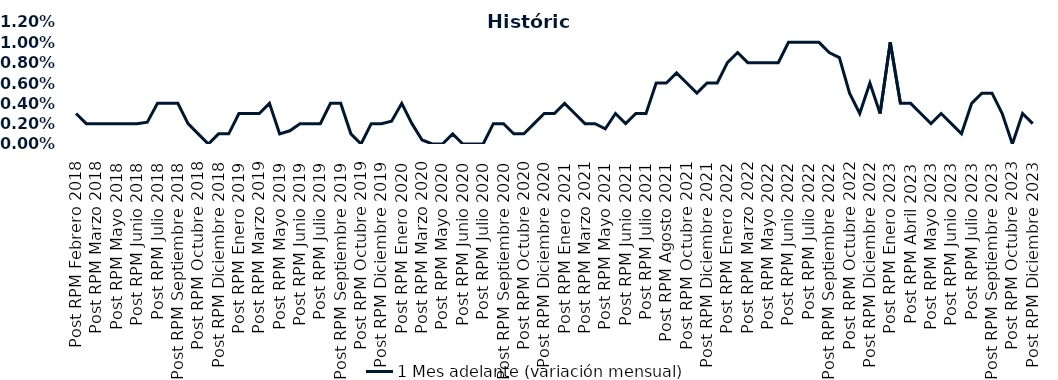
| Category | 1 Mes adelante (variación mensual) |
|---|---|
| Post RPM Febrero 2018 | 0.003 |
| Pre RPM Marzo 2018 | 0.002 |
| Post RPM Marzo 2018 | 0.002 |
| Pre RPM Mayo 2018 | 0.002 |
| Post RPM Mayo 2018 | 0.002 |
| Pre RPM Junio 2018 | 0.002 |
| Post RPM Junio 2018 | 0.002 |
| Pre RPM Julio 2018 | 0.002 |
| Post RPM Julio 2018 | 0.004 |
| Pre RPM Septiembre 2018 | 0.004 |
| Post RPM Septiembre 2018 | 0.004 |
| Pre RPM Octubre 2018 | 0.002 |
| Post RPM Octubre 2018 | 0.001 |
| Pre RPM Diciembre 2018 | 0 |
| Post RPM Diciembre 2018 | 0.001 |
| Pre RPM Enero 2019 | 0.001 |
| Post RPM Enero 2019 | 0.003 |
| Pre RPM Marzo 2019 | 0.003 |
| Post RPM Marzo 2019 | 0.003 |
| Pre RPM Mayo 2019 | 0.004 |
| Post RPM Mayo 2019 | 0.001 |
| Pre RPM Junio 2019 | 0.001 |
| Post RPM Junio 2019 | 0.002 |
| Pre RPM Julio 2019 | 0.002 |
| Post RPM Julio 2019 | 0.002 |
| Pre RPM Septiembre 2019 | 0.004 |
| Post RPM Septiembre 2019 | 0.004 |
| Pre RPM Octubre 2019 | 0.001 |
| Post RPM Octubre 2019 | 0 |
| Pre RPM Diciembre 2019 | 0.002 |
| Post RPM Diciembre 2019 | 0.002 |
| Pre RPM Enero 2020 | 0.002 |
| Post RPM Enero 2020 | 0.004 |
| Pre RPM Marzo 2020 | 0.002 |
| Post RPM Marzo 2020 | 0 |
| Pre RPM Mayo 2020 | 0 |
| Post RPM Mayo 2020 | 0 |
| Pre RPM Junio 2020 | 0.001 |
| Post RPM Junio 2020 | 0 |
| Pre RPM Julio 2020 | 0 |
| Post RPM Julio 2020 | 0 |
| Pre RPM Septiembre 2020 | 0.002 |
| Post RPM Septiembre 2020 | 0.002 |
| Pre RPM Octubre 2020 | 0.001 |
| Post RPM Octubre 2020 | 0.001 |
| Pre RPM Diciembre 2020 | 0.002 |
| Post RPM Diciembre 2020 | 0.003 |
| Pre RPM Enero 2021 | 0.003 |
| Post RPM Enero 2021 | 0.004 |
| Pre RPM Marzo 2021 | 0.003 |
| Post RPM Marzo 2021 | 0.002 |
| Pre RPM Mayo 2021 | 0.002 |
| Post RPM Mayo 2021 | 0.002 |
| Pre RPM Junio 2021 | 0.003 |
| Post RPM Junio 2021 | 0.002 |
| Pre RPM Julio 2021 | 0.003 |
| Post RPM Julio 2021 | 0.003 |
| Pre RPM Agosto 2021 | 0.006 |
| Post RPM Agosto 2021 | 0.006 |
| Pre RPM Octubre 2021 | 0.007 |
| Post RPM Octubre 2021 | 0.006 |
| Pre RPM Diciembre 2021 | 0.005 |
| Post RPM Diciembre 2021 | 0.006 |
| Pre RPM Enero 2022 | 0.006 |
| Post RPM Enero 2022 | 0.008 |
| Pre RPM Marzo 2022 | 0.009 |
| Post RPM Marzo 2022 | 0.008 |
| Pre RPM Mayo 2022 | 0.008 |
| Post RPM Mayo 2022 | 0.008 |
| Pre RPM Junio 2022 | 0.008 |
| Post RPM Junio 2022 | 0.01 |
| Pre RPM Julio 2022 | 0.01 |
| Post RPM Julio 2022 | 0.01 |
| Pre RPM Septiembre 2022 | 0.01 |
| Post RPM Septiembre 2022 | 0.009 |
| Pre RPM Octubre 2022 | 0.008 |
| Post RPM Octubre 2022 | 0.005 |
| Pre RPM Diciembre 2022 | 0.003 |
| Post RPM Diciembre 2022 | 0.006 |
| Pre RPM Enero 2023 | 0.003 |
| Post RPM Enero 2023 | 0.01 |
| Pre RPM Abril 2023 | 0.004 |
| Post RPM Abril 2023 | 0.004 |
| Pre RPM Mayo 2023 | 0.003 |
| Post RPM Mayo 2023 | 0.002 |
| Pre RPM Junio 2023 | 0.003 |
| Post RPM Junio 2023 | 0.002 |
| Pre RPM Julio 2023 | 0.001 |
| Post RPM Julio 2023 | 0.004 |
| Pre RPM Septiembre 2023 | 0.005 |
| Post RPM Septiembre 2023 | 0.005 |
| Pre RPM Octubre 2023 | 0.003 |
| Post RPM Octubre 2023 | 0 |
| Pre RPM Diciembre 2023 | 0.003 |
| Post RPM Diciembre 2023 | 0.002 |